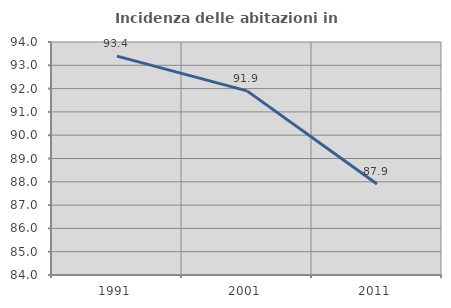
| Category | Incidenza delle abitazioni in proprietà  |
|---|---|
| 1991.0 | 93.392 |
| 2001.0 | 91.903 |
| 2011.0 | 87.903 |